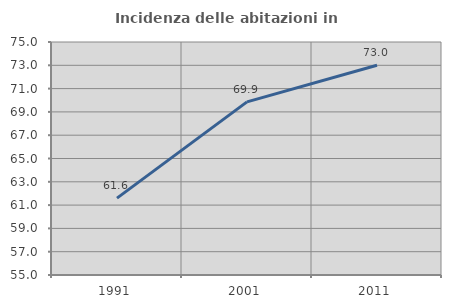
| Category | Incidenza delle abitazioni in proprietà  |
|---|---|
| 1991.0 | 61.596 |
| 2001.0 | 69.863 |
| 2011.0 | 73.003 |